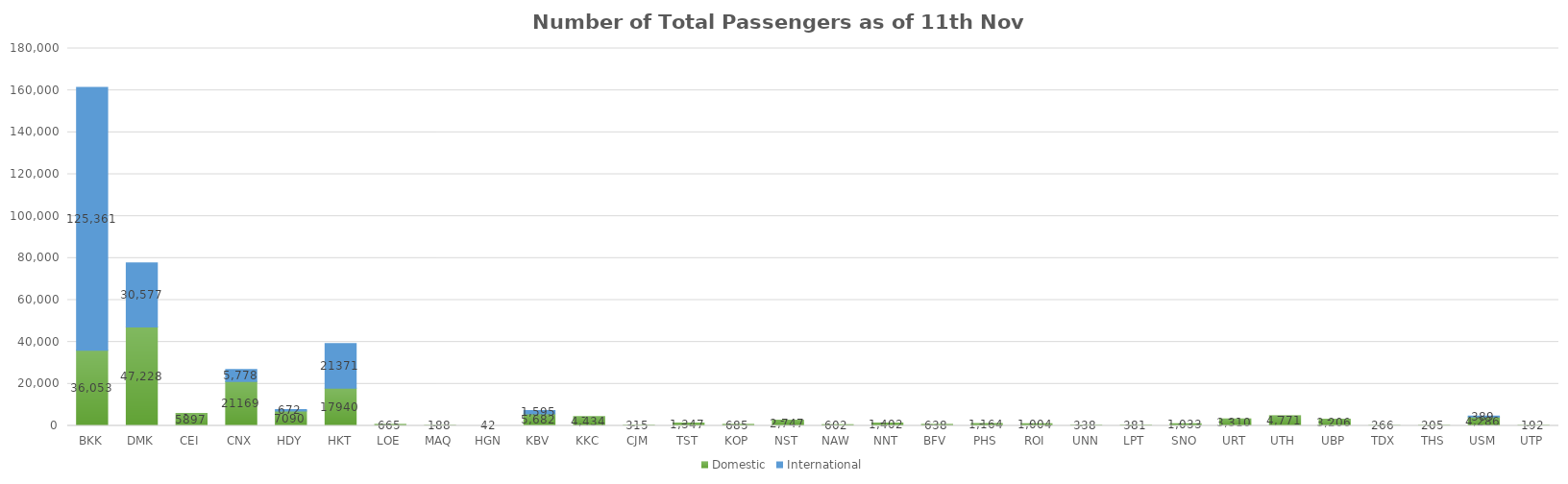
| Category | Domestic | International |
|---|---|---|
| BKK | 36053 | 125361 |
| DMK | 47228 | 30577 |
| CEI | 5897 | 0 |
| CNX | 21169 | 5778 |
| HDY | 7090 | 672 |
| HKT | 17940 | 21371 |
| LOE | 665 | 0 |
| MAQ | 188 | 0 |
| HGN | 42 | 0 |
| KBV | 5682 | 1595 |
| KKC | 4434 | 0 |
| CJM | 315 | 0 |
| TST | 1347 | 0 |
| KOP | 685 | 0 |
| NST | 2747 | 0 |
| NAW | 602 | 0 |
| NNT | 1402 | 0 |
| BFV | 638 | 0 |
| PHS | 1164 | 0 |
| ROI | 1004 | 0 |
| UNN | 338 | 0 |
| LPT | 381 | 0 |
| SNO | 1033 | 0 |
| URT | 3310 | 0 |
| UTH | 4771 | 0 |
| UBP | 3206 | 0 |
| TDX | 266 | 0 |
| THS | 205 | 0 |
| USM | 4286 | 389 |
| UTP | 192 | 0 |